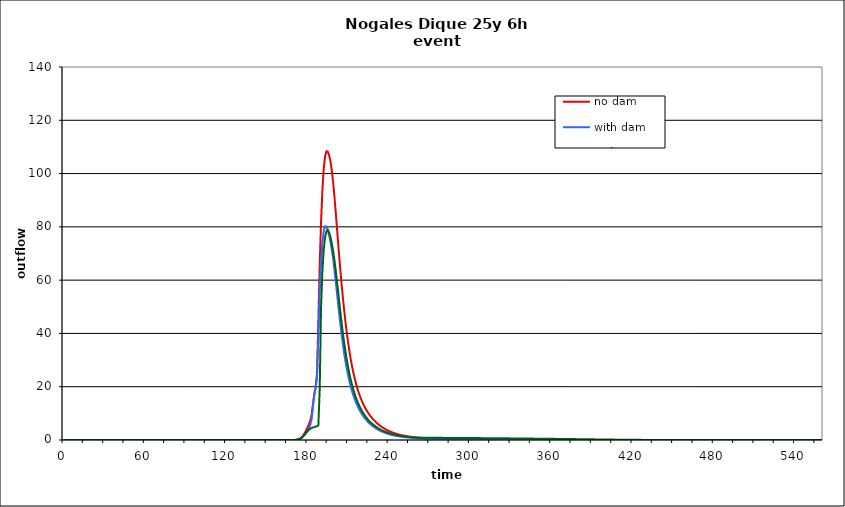
| Category | no dam | with dam | with dam/pond |
|---|---|---|---|
| 0.0 | 0 | 0 | 0 |
| 1.0 | 0 | 0 | 0 |
| 2.0 | 0 | 0 | 0 |
| 3.0 | 0 | 0 | 0 |
| 4.0 | 0 | 0 | 0 |
| 5.0 | 0 | 0 | 0 |
| 6.0 | 0 | 0 | 0 |
| 7.0 | 0 | 0 | 0 |
| 8.0 | 0 | 0 | 0 |
| 9.0 | 0 | 0 | 0 |
| 10.0 | 0 | 0 | 0 |
| 11.0 | 0 | 0 | 0 |
| 12.0 | 0 | 0 | 0 |
| 13.0 | 0 | 0 | 0 |
| 14.0 | 0 | 0 | 0 |
| 15.0 | 0 | 0 | 0 |
| 16.0 | 0 | 0 | 0 |
| 17.0 | 0 | 0 | 0 |
| 18.0 | 0 | 0 | 0 |
| 19.0 | 0 | 0 | 0 |
| 20.0 | 0 | 0 | 0 |
| 21.0 | 0 | 0 | 0 |
| 22.0 | 0 | 0 | 0 |
| 23.0 | 0 | 0 | 0 |
| 24.0 | 0 | 0 | 0 |
| 25.0 | 0 | 0 | 0 |
| 26.0 | 0 | 0 | 0 |
| 27.0 | 0 | 0 | 0 |
| 28.0 | 0 | 0 | 0 |
| 29.0 | 0 | 0 | 0 |
| 30.0 | 0 | 0 | 0 |
| 31.0 | 0 | 0 | 0 |
| 32.0 | 0 | 0 | 0 |
| 33.0 | 0 | 0 | 0 |
| 34.0 | 0 | 0 | 0 |
| 35.0 | 0 | 0 | 0 |
| 36.0 | 0 | 0 | 0 |
| 37.0 | 0 | 0 | 0 |
| 38.0 | 0 | 0 | 0 |
| 39.0 | 0 | 0 | 0 |
| 40.0 | 0 | 0 | 0 |
| 41.0 | 0 | 0 | 0 |
| 42.0 | 0 | 0 | 0 |
| 43.0 | 0 | 0 | 0 |
| 44.0 | 0 | 0 | 0 |
| 45.0 | 0 | 0 | 0 |
| 46.0 | 0 | 0 | 0 |
| 47.0 | 0 | 0 | 0 |
| 48.0 | 0 | 0 | 0 |
| 49.0 | 0 | 0 | 0 |
| 50.0 | 0 | 0 | 0 |
| 51.0 | 0 | 0 | 0 |
| 52.0 | 0 | 0 | 0 |
| 53.0 | 0 | 0 | 0 |
| 54.0 | 0 | 0 | 0 |
| 55.0 | 0 | 0 | 0 |
| 56.0 | 0 | 0 | 0 |
| 57.0 | 0 | 0 | 0 |
| 58.0 | 0 | 0 | 0 |
| 59.0 | 0 | 0 | 0 |
| 60.0 | 0 | 0 | 0 |
| 61.0 | 0 | 0 | 0 |
| 62.0 | 0 | 0 | 0 |
| 63.0 | 0 | 0 | 0 |
| 64.0 | 0 | 0 | 0 |
| 65.0 | 0 | 0 | 0 |
| 66.0 | 0 | 0 | 0 |
| 67.0 | 0 | 0 | 0 |
| 68.0 | 0 | 0 | 0 |
| 69.0 | 0 | 0 | 0 |
| 70.0 | 0 | 0 | 0 |
| 71.0 | 0 | 0 | 0 |
| 72.0 | 0 | 0 | 0 |
| 73.0 | 0 | 0 | 0 |
| 74.0 | 0 | 0 | 0 |
| 75.0 | 0 | 0 | 0 |
| 76.0 | 0 | 0 | 0 |
| 77.0 | 0 | 0 | 0 |
| 78.0 | 0 | 0 | 0 |
| 79.0 | 0 | 0 | 0 |
| 80.0 | 0 | 0 | 0 |
| 81.0 | 0 | 0 | 0 |
| 82.0 | 0 | 0 | 0 |
| 83.0 | 0 | 0 | 0 |
| 84.0 | 0 | 0 | 0 |
| 85.0 | 0 | 0 | 0 |
| 86.0 | 0 | 0 | 0 |
| 87.0 | 0 | 0 | 0 |
| 88.0 | 0 | 0 | 0 |
| 89.0 | 0 | 0 | 0 |
| 90.0 | 0 | 0 | 0 |
| 91.0 | 0 | 0 | 0 |
| 92.0 | 0 | 0 | 0 |
| 93.0 | 0 | 0 | 0 |
| 94.0 | 0 | 0 | 0 |
| 95.0 | 0 | 0 | 0 |
| 96.0 | 0 | 0 | 0 |
| 97.0 | 0 | 0 | 0 |
| 98.0 | 0 | 0 | 0 |
| 99.0 | 0 | 0 | 0 |
| 100.0 | 0 | 0 | 0 |
| 101.0 | 0 | 0 | 0 |
| 102.0 | 0 | 0 | 0 |
| 103.0 | 0 | 0 | 0 |
| 104.0 | 0 | 0 | 0 |
| 105.0 | 0 | 0 | 0 |
| 106.0 | 0 | 0 | 0 |
| 107.0 | 0 | 0 | 0 |
| 108.0 | 0 | 0 | 0 |
| 109.0 | 0 | 0 | 0 |
| 110.0 | 0 | 0 | 0 |
| 111.0 | 0 | 0 | 0 |
| 112.0 | 0 | 0 | 0 |
| 113.0 | 0 | 0 | 0 |
| 114.0 | 0 | 0 | 0 |
| 115.0 | 0 | 0 | 0 |
| 116.0 | 0 | 0 | 0 |
| 117.0 | 0 | 0 | 0 |
| 118.0 | 0 | 0 | 0 |
| 119.0 | 0 | 0 | 0 |
| 120.0 | 0 | 0 | 0 |
| 121.0 | 0 | 0 | 0 |
| 122.0 | 0 | 0 | 0 |
| 123.0 | 0 | 0 | 0 |
| 124.0 | 0 | 0 | 0 |
| 125.0 | 0 | 0 | 0 |
| 126.0 | 0 | 0 | 0 |
| 127.0 | 0 | 0 | 0 |
| 128.0 | 0 | 0 | 0 |
| 129.0 | 0 | 0 | 0 |
| 130.0 | 0 | 0 | 0 |
| 131.0 | 0 | 0 | 0 |
| 132.0 | 0 | 0 | 0 |
| 133.0 | 0 | 0 | 0 |
| 134.0 | 0 | 0 | 0 |
| 135.0 | 0 | 0 | 0 |
| 136.0 | 0 | 0 | 0 |
| 137.0 | 0 | 0 | 0 |
| 138.0 | 0 | 0 | 0 |
| 139.0 | 0 | 0 | 0 |
| 140.0 | 0 | 0 | 0 |
| 141.0 | 0 | 0 | 0 |
| 142.0 | 0 | 0 | 0 |
| 143.0 | 0 | 0 | 0 |
| 144.0 | 0 | 0 | 0 |
| 145.0 | 0 | 0 | 0 |
| 146.0 | 0 | 0 | 0 |
| 147.0 | 0 | 0 | 0 |
| 148.0 | 0 | 0 | 0 |
| 149.0 | 0 | 0 | 0 |
| 150.0 | 0 | 0 | 0 |
| 151.0 | 0 | 0 | 0 |
| 152.0 | 0 | 0 | 0 |
| 153.0 | 0 | 0 | 0 |
| 154.0 | 0 | 0 | 0 |
| 155.0 | 0 | 0 | 0 |
| 156.0 | 0 | 0 | 0 |
| 157.0 | 0 | 0 | 0 |
| 158.0 | 0 | 0 | 0 |
| 159.0 | 0 | 0 | 0 |
| 160.0 | 0 | 0 | 0 |
| 161.0 | 0 | 0 | 0 |
| 162.0 | 0 | 0 | 0 |
| 163.0 | 0 | 0 | 0 |
| 164.0 | 0 | 0.001 | 0.001 |
| 165.0 | 0 | 0.002 | 0.002 |
| 166.0 | 0 | 0.003 | 0.003 |
| 167.0 | 0.001 | 0.006 | 0.006 |
| 168.0 | 0.002 | 0.009 | 0.009 |
| 169.0 | 0.003 | 0.014 | 0.014 |
| 170.0 | 0.005 | 0.021 | 0.021 |
| 171.0 | 0.013 | 0.037 | 0.037 |
| 172.0 | 0.045 | 0.083 | 0.083 |
| 173.0 | 0.135 | 0.183 | 0.183 |
| 174.0 | 0.33 | 0.361 | 0.361 |
| 175.0 | 0.681 | 0.628 | 0.628 |
| 176.0 | 1.207 | 0.996 | 0.996 |
| 177.0 | 1.89 | 1.474 | 1.473 |
| 178.0 | 2.705 | 2.054 | 2.053 |
| 179.0 | 3.656 | 2.708 | 2.706 |
| 180.0 | 4.724 | 3.389 | 3.34 |
| 181.0 | 5.902 | 4.246 | 3.838 |
| 182.0 | 7.212 | 5.632 | 4.209 |
| 183.0 | 9.473 | 7.652 | 4.493 |
| 184.0 | 13.343 | 12.678 | 4.707 |
| 185.0 | 17.08 | 17.184 | 4.876 |
| 186.0 | 19.739 | 19.85 | 5.031 |
| 187.0 | 24.952 | 23.754 | 5.173 |
| 188.0 | 44.86 | 39.017 | 5.552 |
| 189.0 | 66.053 | 55.414 | 19.352 |
| 190.0 | 82.032 | 66.552 | 50.196 |
| 191.0 | 93.971 | 74.297 | 63.544 |
| 192.0 | 102.072 | 78.54 | 71.645 |
| 193.0 | 106.663 | 80.2 | 76.244 |
| 194.0 | 108.4 | 80.145 | 78.424 |
| 195.0 | 108.174 | 78.771 | 78.759 |
| 196.0 | 106.769 | 76.733 | 77.77 |
| 197.0 | 104.356 | 74.24 | 75.957 |
| 198.0 | 100.825 | 71.203 | 73.58 |
| 199.0 | 96.172 | 67.571 | 70.6 |
| 200.0 | 90.56 | 63.366 | 67.017 |
| 201.0 | 84.319 | 58.739 | 62.904 |
| 202.0 | 77.812 | 53.913 | 58.422 |
| 203.0 | 71.358 | 49.104 | 53.778 |
| 204.0 | 65.169 | 44.493 | 49.116 |
| 205.0 | 59.344 | 40.198 | 44.668 |
| 206.0 | 53.941 | 36.269 | 40.489 |
| 207.0 | 48.956 | 32.719 | 36.639 |
| 208.0 | 44.387 | 29.531 | 33.156 |
| 209.0 | 40.225 | 26.682 | 30.005 |
| 210.0 | 36.459 | 24.139 | 27.171 |
| 211.0 | 33.064 | 21.878 | 24.643 |
| 212.0 | 30.02 | 19.865 | 22.367 |
| 213.0 | 27.295 | 18.077 | 20.348 |
| 214.0 | 24.864 | 16.482 | 18.57 |
| 215.0 | 22.693 | 15.057 | 16.935 |
| 216.0 | 20.751 | 13.781 | 15.487 |
| 217.0 | 19.008 | 12.634 | 14.222 |
| 218.0 | 17.443 | 11.6 | 13.064 |
| 219.0 | 16.037 | 10.668 | 11.99 |
| 220.0 | 14.771 | 9.823 | 11.037 |
| 221.0 | 13.632 | 9.056 | 10.199 |
| 222.0 | 12.595 | 8.359 | 9.446 |
| 223.0 | 11.65 | 7.723 | 8.733 |
| 224.0 | 10.787 | 7.142 | 8.052 |
| 225.0 | 9.997 | 6.609 | 7.438 |
| 226.0 | 9.273 | 6.122 | 6.898 |
| 227.0 | 8.607 | 5.674 | 6.417 |
| 228.0 | 7.994 | 5.263 | 5.981 |
| 229.0 | 7.429 | 4.887 | 5.581 |
| 230.0 | 6.907 | 4.541 | 5.2 |
| 231.0 | 6.424 | 4.221 | 4.823 |
| 232.0 | 5.979 | 3.925 | 4.469 |
| 233.0 | 5.567 | 3.651 | 4.152 |
| 234.0 | 5.185 | 3.397 | 3.871 |
| 235.0 | 4.832 | 3.161 | 3.616 |
| 236.0 | 4.504 | 2.942 | 3.383 |
| 237.0 | 4.199 | 2.738 | 3.169 |
| 238.0 | 3.916 | 2.549 | 2.97 |
| 239.0 | 3.653 | 2.373 | 2.786 |
| 240.0 | 3.408 | 2.211 | 2.615 |
| 241.0 | 3.179 | 2.063 | 2.455 |
| 242.0 | 2.966 | 1.93 | 2.302 |
| 243.0 | 2.767 | 1.811 | 2.155 |
| 244.0 | 2.582 | 1.702 | 2.018 |
| 245.0 | 2.408 | 1.602 | 1.897 |
| 246.0 | 2.249 | 1.509 | 1.788 |
| 247.0 | 2.106 | 1.423 | 1.69 |
| 248.0 | 1.975 | 1.343 | 1.601 |
| 249.0 | 1.856 | 1.268 | 1.518 |
| 250.0 | 1.746 | 1.198 | 1.441 |
| 251.0 | 1.645 | 1.133 | 1.37 |
| 252.0 | 1.551 | 1.072 | 1.303 |
| 253.0 | 1.465 | 1.015 | 1.24 |
| 254.0 | 1.384 | 0.961 | 1.181 |
| 255.0 | 1.309 | 0.91 | 1.126 |
| 256.0 | 1.24 | 0.862 | 1.074 |
| 257.0 | 1.174 | 0.817 | 1.025 |
| 258.0 | 1.113 | 0.775 | 0.979 |
| 259.0 | 1.056 | 0.736 | 0.937 |
| 260.0 | 1.002 | 0.698 | 0.9 |
| 261.0 | 0.951 | 0.663 | 0.872 |
| 262.0 | 0.904 | 0.63 | 0.853 |
| 263.0 | 0.858 | 0.599 | 0.842 |
| 264.0 | 0.816 | 0.57 | 0.835 |
| 265.0 | 0.776 | 0.542 | 0.831 |
| 266.0 | 0.738 | 0.516 | 0.828 |
| 267.0 | 0.702 | 0.491 | 0.826 |
| 268.0 | 0.668 | 0.468 | 0.824 |
| 269.0 | 0.637 | 0.446 | 0.821 |
| 270.0 | 0.606 | 0.426 | 0.819 |
| 271.0 | 0.578 | 0.406 | 0.817 |
| 272.0 | 0.551 | 0.388 | 0.815 |
| 273.0 | 0.526 | 0.371 | 0.813 |
| 274.0 | 0.502 | 0.354 | 0.81 |
| 275.0 | 0.479 | 0.339 | 0.808 |
| 276.0 | 0.457 | 0.324 | 0.806 |
| 277.0 | 0.437 | 0.31 | 0.803 |
| 278.0 | 0.418 | 0.297 | 0.801 |
| 279.0 | 0.399 | 0.285 | 0.798 |
| 280.0 | 0.382 | 0.273 | 0.795 |
| 281.0 | 0.365 | 0.261 | 0.793 |
| 282.0 | 0.35 | 0.251 | 0.79 |
| 283.0 | 0.335 | 0.241 | 0.787 |
| 284.0 | 0.321 | 0.231 | 0.784 |
| 285.0 | 0.307 | 0.222 | 0.781 |
| 286.0 | 0.294 | 0.213 | 0.778 |
| 287.0 | 0.282 | 0.204 | 0.775 |
| 288.0 | 0.27 | 0.196 | 0.772 |
| 289.0 | 0.26 | 0.189 | 0.769 |
| 290.0 | 0.249 | 0.181 | 0.766 |
| 291.0 | 0.239 | 0.175 | 0.763 |
| 292.0 | 0.229 | 0.168 | 0.759 |
| 293.0 | 0.22 | 0.162 | 0.756 |
| 294.0 | 0.212 | 0.155 | 0.753 |
| 295.0 | 0.203 | 0.15 | 0.749 |
| 296.0 | 0.195 | 0.144 | 0.746 |
| 297.0 | 0.188 | 0.139 | 0.742 |
| 298.0 | 0.181 | 0.134 | 0.739 |
| 299.0 | 0.174 | 0.129 | 0.736 |
| 300.0 | 0.167 | 0.124 | 0.732 |
| 301.0 | 0.161 | 0.12 | 0.728 |
| 302.0 | 0.155 | 0.116 | 0.725 |
| 303.0 | 0.149 | 0.112 | 0.721 |
| 304.0 | 0.144 | 0.108 | 0.718 |
| 305.0 | 0.138 | 0.104 | 0.714 |
| 306.0 | 0.133 | 0.1 | 0.71 |
| 307.0 | 0.128 | 0.097 | 0.706 |
| 308.0 | 0.124 | 0.094 | 0.703 |
| 309.0 | 0.119 | 0.09 | 0.699 |
| 310.0 | 0.115 | 0.087 | 0.695 |
| 311.0 | 0.111 | 0.084 | 0.691 |
| 312.0 | 0.107 | 0.082 | 0.687 |
| 313.0 | 0.103 | 0.079 | 0.683 |
| 314.0 | 0.1 | 0.076 | 0.679 |
| 315.0 | 0.096 | 0.074 | 0.675 |
| 316.0 | 0.093 | 0.072 | 0.671 |
| 317.0 | 0.09 | 0.069 | 0.667 |
| 318.0 | 0.087 | 0.067 | 0.663 |
| 319.0 | 0.084 | 0.065 | 0.659 |
| 320.0 | 0.081 | 0.063 | 0.654 |
| 321.0 | 0.078 | 0.061 | 0.65 |
| 322.0 | 0.075 | 0.059 | 0.645 |
| 323.0 | 0.073 | 0.057 | 0.64 |
| 324.0 | 0.07 | 0.056 | 0.635 |
| 325.0 | 0.068 | 0.054 | 0.63 |
| 326.0 | 0.066 | 0.052 | 0.625 |
| 327.0 | 0.064 | 0.051 | 0.62 |
| 328.0 | 0.062 | 0.049 | 0.615 |
| 329.0 | 0.06 | 0.048 | 0.61 |
| 330.0 | 0.058 | 0.046 | 0.605 |
| 331.0 | 0.056 | 0.045 | 0.6 |
| 332.0 | 0.054 | 0.044 | 0.595 |
| 333.0 | 0.052 | 0.043 | 0.59 |
| 334.0 | 0.05 | 0.041 | 0.584 |
| 335.0 | 0.049 | 0.04 | 0.579 |
| 336.0 | 0.047 | 0.039 | 0.574 |
| 337.0 | 0.046 | 0.038 | 0.569 |
| 338.0 | 0.044 | 0.037 | 0.563 |
| 339.0 | 0.043 | 0.036 | 0.558 |
| 340.0 | 0.042 | 0.035 | 0.553 |
| 341.0 | 0.04 | 0.034 | 0.548 |
| 342.0 | 0.039 | 0.033 | 0.542 |
| 343.0 | 0.038 | 0.032 | 0.537 |
| 344.0 | 0.037 | 0.031 | 0.531 |
| 345.0 | 0.036 | 0.031 | 0.526 |
| 346.0 | 0.035 | 0.03 | 0.521 |
| 347.0 | 0.034 | 0.029 | 0.515 |
| 348.0 | 0.033 | 0.028 | 0.51 |
| 349.0 | 0.032 | 0.028 | 0.504 |
| 350.0 | 0.031 | 0.027 | 0.499 |
| 351.0 | 0.03 | 0.026 | 0.493 |
| 352.0 | 0.029 | 0.026 | 0.487 |
| 353.0 | 0.028 | 0.025 | 0.482 |
| 354.0 | 0.027 | 0.024 | 0.476 |
| 355.0 | 0.026 | 0.024 | 0.47 |
| 356.0 | 0.026 | 0.023 | 0.464 |
| 357.0 | 0.025 | 0.023 | 0.458 |
| 358.0 | 0.024 | 0.022 | 0.452 |
| 359.0 | 0.023 | 0.022 | 0.446 |
| 360.0 | 0.023 | 0.021 | 0.439 |
| 361.0 | 0.022 | 0.021 | 0.433 |
| 362.0 | 0.021 | 0.02 | 0.427 |
| 363.0 | 0.021 | 0.02 | 0.421 |
| 364.0 | 0.02 | 0.019 | 0.415 |
| 365.0 | 0.02 | 0.019 | 0.409 |
| 366.0 | 0.019 | 0.018 | 0.402 |
| 367.0 | 0.018 | 0.018 | 0.396 |
| 368.0 | 0.018 | 0.018 | 0.39 |
| 369.0 | 0.017 | 0.017 | 0.384 |
| 370.0 | 0.017 | 0.017 | 0.377 |
| 371.0 | 0.016 | 0.016 | 0.371 |
| 372.0 | 0.016 | 0.016 | 0.365 |
| 373.0 | 0.015 | 0.016 | 0.359 |
| 374.0 | 0.015 | 0.015 | 0.352 |
| 375.0 | 0.014 | 0.015 | 0.346 |
| 376.0 | 0.014 | 0.015 | 0.34 |
| 377.0 | 0.014 | 0.014 | 0.333 |
| 378.0 | 0.013 | 0.014 | 0.327 |
| 379.0 | 0.013 | 0.014 | 0.321 |
| 380.0 | 0.012 | 0.014 | 0.314 |
| 381.0 | 0.012 | 0.013 | 0.308 |
| 382.0 | 0.012 | 0.013 | 0.301 |
| 383.0 | 0.011 | 0.013 | 0.294 |
| 384.0 | 0.011 | 0.013 | 0.287 |
| 385.0 | 0.01 | 0.012 | 0.281 |
| 386.0 | 0.01 | 0.012 | 0.274 |
| 387.0 | 0.01 | 0.012 | 0.267 |
| 388.0 | 0.009 | 0.012 | 0.26 |
| 389.0 | 0.009 | 0.011 | 0.254 |
| 390.0 | 0.009 | 0.011 | 0.247 |
| 391.0 | 0.008 | 0.011 | 0.24 |
| 392.0 | 0.008 | 0.011 | 0.234 |
| 393.0 | 0.008 | 0.01 | 0.227 |
| 394.0 | 0.007 | 0.01 | 0.221 |
| 395.0 | 0.007 | 0.01 | 0.214 |
| 396.0 | 0.007 | 0.01 | 0.208 |
| 397.0 | 0.006 | 0.01 | 0.202 |
| 398.0 | 0.006 | 0.009 | 0.195 |
| 399.0 | 0.006 | 0.009 | 0.189 |
| 400.0 | 0.006 | 0.009 | 0.183 |
| 401.0 | 0.005 | 0.009 | 0.177 |
| 402.0 | 0.005 | 0.008 | 0.17 |
| 403.0 | 0.005 | 0.008 | 0.164 |
| 404.0 | 0.004 | 0.008 | 0.158 |
| 405.0 | 0.004 | 0.008 | 0.151 |
| 406.0 | 0.004 | 0.008 | 0.144 |
| 407.0 | 0.004 | 0.008 | 0.138 |
| 408.0 | 0.004 | 0.007 | 0.131 |
| 409.0 | 0.003 | 0.007 | 0.124 |
| 410.0 | 0.003 | 0.007 | 0.117 |
| 411.0 | 0.003 | 0.007 | 0.111 |
| 412.0 | 0.003 | 0.007 | 0.104 |
| 413.0 | 0.003 | 0.007 | 0.098 |
| 414.0 | 0.002 | 0.006 | 0.093 |
| 415.0 | 0.002 | 0.006 | 0.088 |
| 416.0 | 0.002 | 0.006 | 0.083 |
| 417.0 | 0.002 | 0.006 | 0.078 |
| 418.0 | 0.002 | 0.006 | 0.073 |
| 419.0 | 0.002 | 0.006 | 0.069 |
| 420.0 | 0.001 | 0.005 | 0.066 |
| 421.0 | 0.001 | 0.005 | 0.062 |
| 422.0 | 0.001 | 0.005 | 0.059 |
| 423.0 | 0.001 | 0.005 | 0.055 |
| 424.0 | 0.001 | 0.005 | 0.052 |
| 425.0 | 0.001 | 0.005 | 0.05 |
| 426.0 | 0.001 | 0.005 | 0.047 |
| 427.0 | 0.001 | 0.005 | 0.045 |
| 428.0 | 0.001 | 0.004 | 0.042 |
| 429.0 | 0.001 | 0.004 | 0.04 |
| 430.0 | 0 | 0.004 | 0.038 |
| 431.0 | 0 | 0.004 | 0.036 |
| 432.0 | 0 | 0.004 | 0.035 |
| 433.0 | 0 | 0.004 | 0.033 |
| 434.0 | 0 | 0.004 | 0.031 |
| 435.0 | 0 | 0.004 | 0.03 |
| 436.0 | 0 | 0.004 | 0.028 |
| 437.0 | 0 | 0.003 | 0.027 |
| 438.0 | 0 | 0.003 | 0.026 |
| 439.0 | 0 | 0.003 | 0.025 |
| 440.0 | 0 | 0.003 | 0.024 |
| 441.0 | 0 | 0.003 | 0.023 |
| 442.0 | 0 | 0.003 | 0.022 |
| 443.0 | 0 | 0.003 | 0.021 |
| 444.0 | 0 | 0.003 | 0.02 |
| 445.0 | 0 | 0.003 | 0.019 |
| 446.0 | 0 | 0.003 | 0.018 |
| 447.0 | 0 | 0.002 | 0.017 |
| 448.0 | 0 | 0.002 | 0.017 |
| 449.0 | 0 | 0.002 | 0.016 |
| 450.0 | 0 | 0.002 | 0.015 |
| 451.0 | 0 | 0.002 | 0.015 |
| 452.0 | 0 | 0.002 | 0.014 |
| 453.0 | 0 | 0.002 | 0.014 |
| 454.0 | 0 | 0.002 | 0.013 |
| 455.0 | 0 | 0.002 | 0.013 |
| 456.0 | 0 | 0.002 | 0.012 |
| 457.0 | 0 | 0.002 | 0.012 |
| 458.0 | 0 | 0.002 | 0.011 |
| 459.0 | 0 | 0.002 | 0.011 |
| 460.0 | 0 | 0.002 | 0.01 |
| 461.0 | 0 | 0.002 | 0.01 |
| 462.0 | 0 | 0.002 | 0.01 |
| 463.0 | 0 | 0.001 | 0.009 |
| 464.0 | 0 | 0.001 | 0.009 |
| 465.0 | 0 | 0.001 | 0.008 |
| 466.0 | 0 | 0.001 | 0.008 |
| 467.0 | 0 | 0.001 | 0.008 |
| 468.0 | 0 | 0.001 | 0.007 |
| 469.0 | 0 | 0.001 | 0.007 |
| 470.0 | 0 | 0.001 | 0.007 |
| 471.0 | 0 | 0.001 | 0.007 |
| 472.0 | 0 | 0.001 | 0.006 |
| 473.0 | 0 | 0.001 | 0.006 |
| 474.0 | 0 | 0.001 | 0.006 |
| 475.0 | 0 | 0.001 | 0.006 |
| 476.0 | 0 | 0.001 | 0.005 |
| 477.0 | 0 | 0.001 | 0.005 |
| 478.0 | 0 | 0.001 | 0.005 |
| 479.0 | 0 | 0.001 | 0.005 |
| 480.0 | 0 | 0.001 | 0.004 |
| 481.0 | 0 | 0.001 | 0.004 |
| 482.0 | 0 | 0.001 | 0.004 |
| 483.0 | 0 | 0.001 | 0.004 |
| 484.0 | 0 | 0.001 | 0.004 |
| 485.0 | 0 | 0.001 | 0.004 |
| 486.0 | 0 | 0.001 | 0.003 |
| 487.0 | 0 | 0.001 | 0.003 |
| 488.0 | 0 | 0.001 | 0.003 |
| 489.0 | 0 | 0.001 | 0.003 |
| 490.0 | 0 | 0.001 | 0.003 |
| 491.0 | 0 | 0.001 | 0.003 |
| 492.0 | 0 | 0.001 | 0.003 |
| 493.0 | 0 | 0.001 | 0.003 |
| 494.0 | 0 | 0.001 | 0.002 |
| 495.0 | 0 | 0.001 | 0.002 |
| 496.0 | 0 | 0.001 | 0.002 |
| 497.0 | 0 | 0.001 | 0.002 |
| 498.0 | 0 | 0.001 | 0.002 |
| 499.0 | 0 | 0.001 | 0.002 |
| 500.0 | 0 | 0.001 | 0.002 |
| 501.0 | 0 | 0.001 | 0.002 |
| 502.0 | 0 | 0.001 | 0.002 |
| 503.0 | 0 | 0.001 | 0.002 |
| 504.0 | 0 | 0.001 | 0.002 |
| 505.0 | 0 | 0.001 | 0.002 |
| 506.0 | 0 | 0.001 | 0.002 |
| 507.0 | 0 | 0.001 | 0.001 |
| 508.0 | 0 | 0.001 | 0.001 |
| 509.0 | 0 | 0.001 | 0.001 |
| 510.0 | 0 | 0.001 | 0.001 |
| 511.0 | 0 | 0.001 | 0.001 |
| 512.0 | 0 | 0.001 | 0.001 |
| 513.0 | 0 | 0.001 | 0.001 |
| 514.0 | 0 | 0.001 | 0.001 |
| 515.0 | 0 | 0.001 | 0.001 |
| 516.0 | 0 | 0.001 | 0.001 |
| 517.0 | 0 | 0.001 | 0.001 |
| 518.0 | 0 | 0.001 | 0.001 |
| 519.0 | 0 | 0.001 | 0.001 |
| 520.0 | 0 | 0.001 | 0.001 |
| 521.0 | 0 | 0.001 | 0.001 |
| 522.0 | 0 | 0.001 | 0.001 |
| 523.0 | 0 | 0.001 | 0.001 |
| 524.0 | 0 | 0.001 | 0.001 |
| 525.0 | 0 | 0.001 | 0.001 |
| 526.0 | 0 | 0.001 | 0.001 |
| 527.0 | 0 | 0.001 | 0.001 |
| 528.0 | 0 | 0.001 | 0.001 |
| 529.0 | 0 | 0.001 | 0.001 |
| 530.0 | 0 | 0.001 | 0.001 |
| 531.0 | 0 | 0.001 | 0.001 |
| 532.0 | 0 | 0.001 | 0.001 |
| 533.0 | 0 | 0.001 | 0.001 |
| 534.0 | 0 | 0.001 | 0.001 |
| 535.0 | 0 | 0.001 | 0.001 |
| 536.0 | 0 | 0.001 | 0.001 |
| 537.0 | 0 | 0.001 | 0.001 |
| 538.0 | 0 | 0.001 | 0.001 |
| 539.0 | 0 | 0.001 | 0.001 |
| 540.0 | 0 | 0.001 | 0.001 |
| 541.0 | 0 | 0.001 | 0.001 |
| 542.0 | 0 | 0.001 | 0.001 |
| 543.0 | 0 | 0.001 | 0.001 |
| 544.0 | 0 | 0.001 | 0.001 |
| 545.0 | 0 | 0.001 | 0.001 |
| 546.0 | 0 | 0.001 | 0.001 |
| 547.0 | 0 | 0.001 | 0.001 |
| 548.0 | 0 | 0.001 | 0.001 |
| 549.0 | 0 | 0.001 | 0.001 |
| 550.0 | 0 | 0.001 | 0.001 |
| 551.0 | 0 | 0.001 | 0.001 |
| 552.0 | 0 | 0.001 | 0.001 |
| 553.0 | 0 | 0.001 | 0.001 |
| 554.0 | 0 | 0.001 | 0.001 |
| 555.0 | 0 | 0.001 | 0.001 |
| 556.0 | 0 | 0.001 | 0.001 |
| 557.0 | 0 | 0.001 | 0.001 |
| 558.0 | 0 | 0.001 | 0.001 |
| 559.0 | 0 | 0.001 | 0.001 |
| 560.0 | 0 | 0.001 | 0.001 |